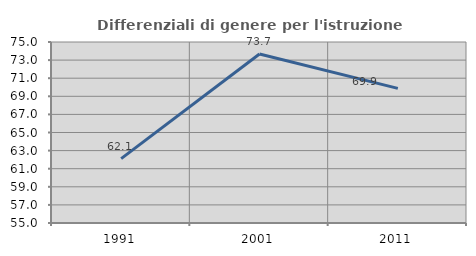
| Category | Differenziali di genere per l'istruzione superiore |
|---|---|
| 1991.0 | 62.114 |
| 2001.0 | 73.677 |
| 2011.0 | 69.878 |